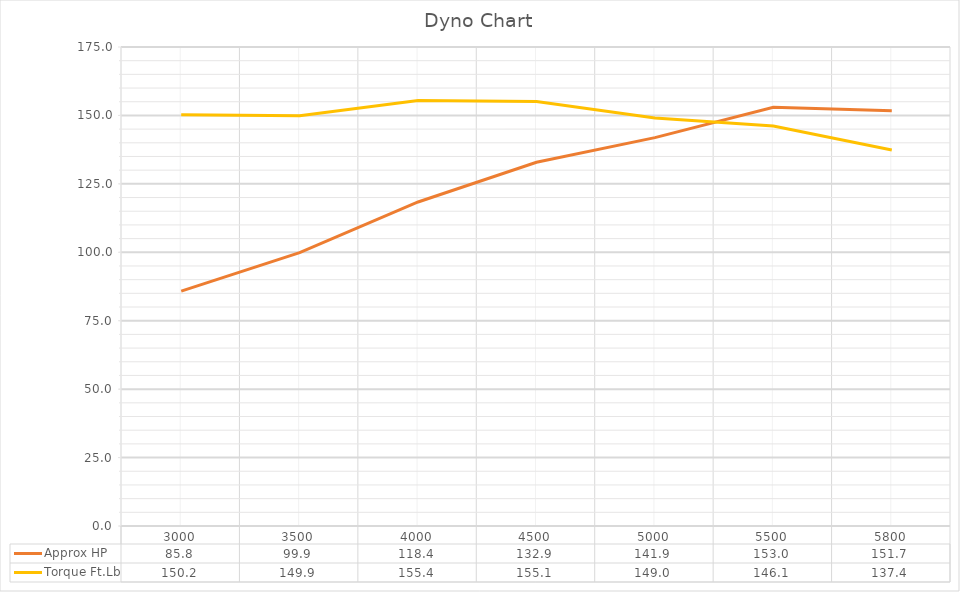
| Category | Approx HP | Torque Ft.Lb |
|---|---|---|
| 3000.0 | 85.808 | 150.224 |
| 3500.0 | 99.865 | 149.858 |
| 4000.0 | 118.387 | 155.446 |
| 4500.0 | 132.872 | 155.079 |
| 5000.0 | 141.88 | 149.034 |
| 5500.0 | 152.998 | 146.102 |
| 5800.0 | 151.734 | 137.4 |